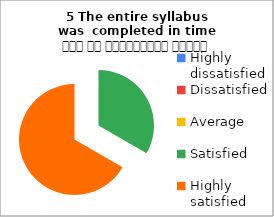
| Category | 5 The entire syllabus was  completed in time समय पर पाठ्यक्रम पूर्ण हुआ |
|---|---|
| Highly dissatisfied | 0 |
| Dissatisfied | 0 |
| Average | 0 |
| Satisfied | 2 |
| Highly satisfied | 4 |